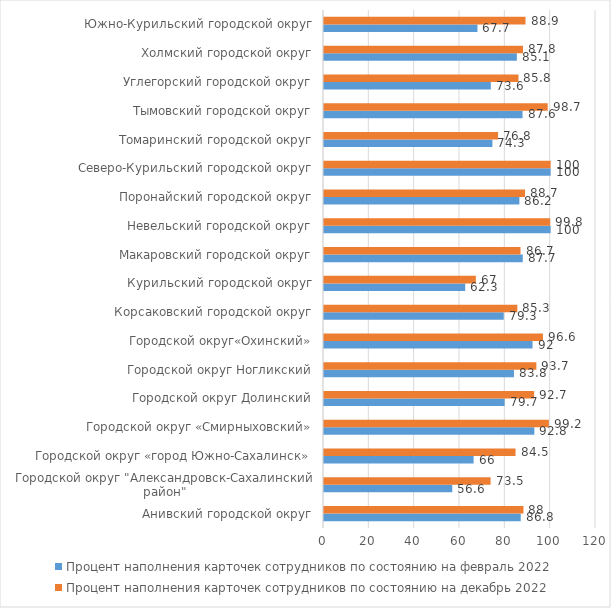
| Category | Процент наполнения карточек сотрудников по состоянию на февраль 2022 | Процент наполнения карточек сотрудников по состоянию на декабрь 2022 |
|---|---|---|
| Анивский городской округ | 86.8 | 88 |
| Городской округ "Александровск-Сахалинский район" | 56.6 | 73.5 |
| Городской округ «город Южно-Сахалинск» | 66 | 84.5 |
| Городской округ «Смирныховский» | 92.8 | 99.2 |
| Городской округ Долинский | 79.7 | 92.7 |
| Городской округ Ногликский | 83.8 | 93.7 |
| Городской округ«Охинский» | 92 | 96.6 |
| Корсаковский городской округ | 79.3 | 85.3 |
| Курильский городской округ | 62.3 | 67 |
| Макаровский городской округ | 87.7 | 86.7 |
| Невельский городской округ | 100 | 99.8 |
| Поронайский городской округ | 86.2 | 88.7 |
| Северо-Курильский городской округ | 100 | 100 |
| Томаринский городской округ | 74.3 | 76.8 |
| Тымовский городской округ | 87.6 | 98.7 |
| Углегорский городской округ | 73.6 | 85.8 |
| Холмский городской округ | 85.1 | 87.8 |
| Южно-Курильский городской округ | 67.7 | 88.9 |